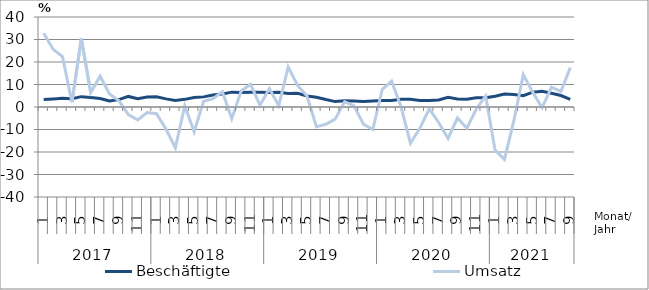
| Category | Beschäftigte | Umsatz |
|---|---|---|
| 0 | 3.3 | 32.8 |
| 1 | 3.6 | 25.7 |
| 2 | 3.9 | 22.4 |
| 3 | 3.7 | 2.1 |
| 4 | 4.6 | 30.4 |
| 5 | 4.2 | 6.4 |
| 6 | 3.8 | 13.7 |
| 7 | 2.7 | 5.8 |
| 8 | 3.3 | 2.8 |
| 9 | 4.7 | -3.4 |
| 10 | 3.7 | -5.8 |
| 11 | 4.4 | -2.5 |
| 12 | 4.5 | -3 |
| 13 | 3.6 | -9.8 |
| 14 | 2.9 | -18.1 |
| 15 | 3.4 | 0.5 |
| 16 | 4.2 | -11 |
| 17 | 4.5 | 2.5 |
| 18 | 5.3 | 3.7 |
| 19 | 5.8 | 6.8 |
| 20 | 6.6 | -5.2 |
| 21 | 6.5 | 7.1 |
| 22 | 6.6 | 10.1 |
| 23 | 6.6 | 0.8 |
| 24 | 6.4 | 8.2 |
| 25 | 6.5 | 0.6 |
| 26 | 6 | 17.8 |
| 27 | 6.1 | 9.6 |
| 28 | 4.9 | 4.9 |
| 29 | 4.3 | -8.8 |
| 30 | 3.3 | -7.7 |
| 31 | 2.4 | -5.4 |
| 32 | 2.8 | 2.4 |
| 33 | 2.7 | 0.5 |
| 34 | 2.5 | -7.6 |
| 35 | 2.7 | -10 |
| 36 | 2.9 | 7.8 |
| 37 | 2.9 | 11.5 |
| 38 | 3.4 | 0.1 |
| 39 | 3.4 | -16.1 |
| 40 | 2.9 | -9.5 |
| 41 | 2.9 | -0.8 |
| 42 | 3.1 | -6.9 |
| 43 | 4.3 | -14 |
| 44 | 3.6 | -4.9 |
| 45 | 3.4 | -9.4 |
| 46 | 4.1 | -0.9 |
| 47 | 4.1 | 4.9 |
| 48 | 4.8 | -19.1 |
| 49 | 5.8 | -23.3 |
| 50 | 5.6 | -6.1 |
| 51 | 5 | 14.4 |
| 52 | 6.6 | 6.6 |
| 53 | 7 | -0.3 |
| 54 | 6.1 | 8.8 |
| 55 | 5.1 | 6.9 |
| 56 | 3.4 | 17.5 |